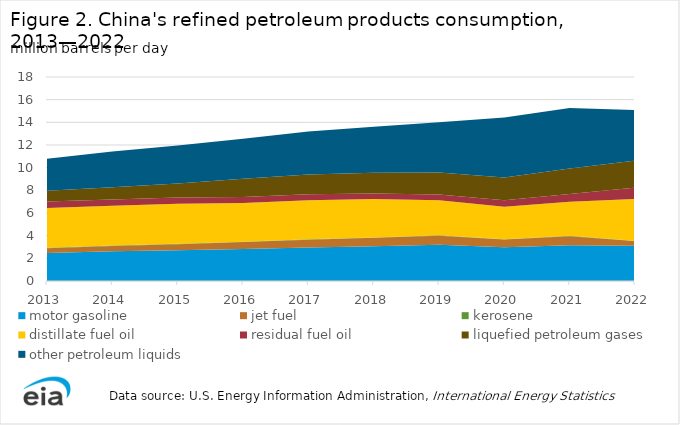
| Category | motor gasoline | jet fuel   | kerosene  | distillate fuel oil  | residual fuel oil  | liquefied petroleum gases  | other petroleum liquids  |
|---|---|---|---|---|---|---|---|
| 2013.0 | 2.463 | 0.434 | 0.035 | 3.503 | 0.58 | 0.947 | 2.818 |
| 2014.0 | 2.615 | 0.481 | 0.025 | 3.514 | 0.553 | 1.074 | 3.156 |
| 2015.0 | 2.707 | 0.544 | 0.034 | 3.539 | 0.534 | 1.244 | 3.357 |
| 2016.0 | 2.819 | 0.612 | 0.033 | 3.424 | 0.53 | 1.6 | 3.538 |
| 2017.0 | 2.958 | 0.689 | 0.033 | 3.444 | 0.529 | 1.735 | 3.813 |
| 2018.0 | 3.058 | 0.752 | 0.034 | 3.386 | 0.5 | 1.822 | 4.057 |
| 2019.0 | 3.193 | 0.802 | 0.033 | 3.098 | 0.517 | 1.927 | 4.439 |
| 2020.0 | 2.984 | 0.669 | 0.033 | 2.872 | 0.564 | 2.006 | 5.306 |
| 2021.0 | 3.15 | 0.8 | 0.033 | 3 | 0.685 | 2.259 | 5.339 |
| 2022.0 | 3.105 | 0.413 | 0.03 | 3.7 | 0.99 | 2.39 | 4.45 |